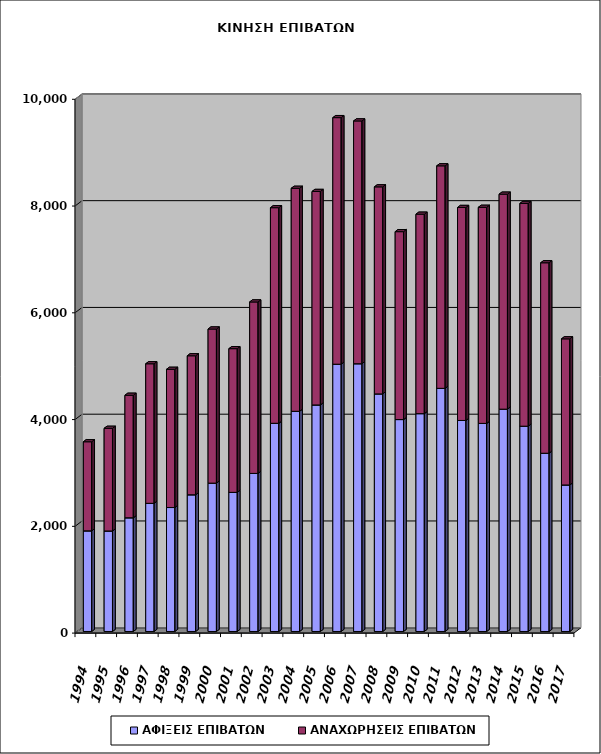
| Category | ΑΦΙΞΕΙΣ ΕΠΙΒΑΤΩΝ | ΑΝΑΧΩΡΗΣΕΙΣ ΕΠΙΒΑΤΩΝ |
|---|---|---|
| 1994.0 | 1885 | 1669 |
| 1995.0 | 1883 | 1923 |
| 1996.0 | 2130 | 2295 |
| 1997.0 | 2401 | 2614 |
| 1998.0 | 2322 | 2589 |
| 1999.0 | 2561 | 2604 |
| 2000.0 | 2779 | 2887 |
| 2001.0 | 2606 | 2692 |
| 2002.0 | 2961 | 3212 |
| 2003.0 | 3900 | 4039 |
| 2004.0 | 4125 | 4177 |
| 2005.0 | 4244 | 3999 |
| 2006.0 | 5007 | 4619 |
| 2007.0 | 5016 | 4548 |
| 2008.0 | 4451 | 3878 |
| 2009.0 | 3970 | 3520 |
| 2010.0 | 4081 | 3736 |
| 2011.0 | 4555 | 4168 |
| 2012.0 | 3953 | 3990 |
| 2013.0 | 3898 | 4048 |
| 2014.0 | 4165 | 4027 |
| 2015.0 | 3846 | 4173 |
| 2016.0 | 3339 | 3568 |
| 2017.0 | 2745 | 2737 |